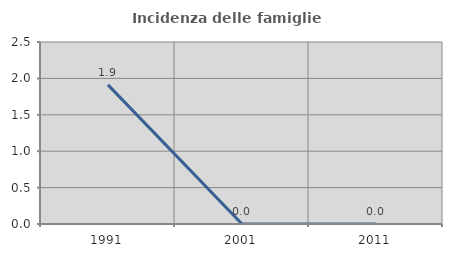
| Category | Incidenza delle famiglie numerose |
|---|---|
| 1991.0 | 1.911 |
| 2001.0 | 0 |
| 2011.0 | 0 |